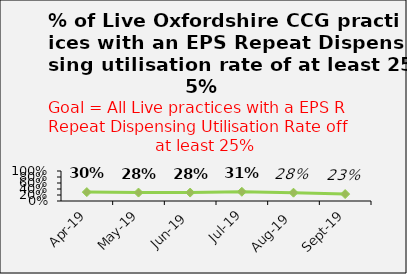
| Category | Series 0 |
|---|---|
| 2019-04-01 | 0.297 |
| 2019-05-01 | 0.281 |
| 2019-06-01 | 0.281 |
| 2019-07-01 | 0.308 |
| 2019-08-01 | 0.277 |
| 2019-09-01 | 0.231 |